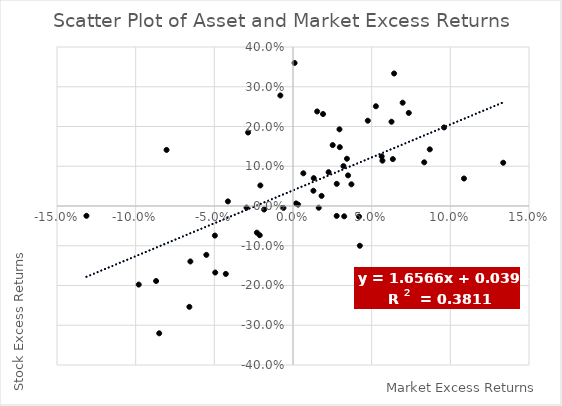
| Category | Series 0 |
|---|---|
| -0.06587087129683424 | -0.254 |
| 0.06260934946115085 | 0.212 |
| 0.01815649147565336 | 0.025 |
| -0.018343063746821885 | -0.009 |
| 0.012971536542138586 | 0.038 |
| 0.025224695968268752 | 0.153 |
| 0.0349983023841872 | 0.077 |
| 0.02262080186645983 | 0.085 |
| 0.0032107368412471428 | 0.004 |
| -0.08036566176639262 | 0.141 |
| -0.13128730198391583 | -0.025 |
| 0.13361053214688012 | 0.109 |
| 0.04754526597522245 | 0.215 |
| 0.013175469841449006 | 0.07 |
| 0.0634518169512963 | 0.118 |
| 0.06969687803905077 | 0.26 |
| -0.04138149329786979 | 0.012 |
| -0.021130452510789387 | -0.073 |
| 0.10867709437956295 | 0.069 |
| 0.032546548423369334 | -0.026 |
| -0.006071305706916397 | -0.005 |
| 0.027805366320762026 | 0.056 |
| 0.04198659736409405 | -0.027 |
| 0.056358993397591206 | 0.125 |
| 0.006566184517935447 | 0.082 |
| 0.019093292384859906 | 0.231 |
| 0.02776392302925701 | -0.025 |
| 0.029759909155611997 | 0.148 |
| -0.04965016943263956 | -0.074 |
| 0.07359225346111042 | 0.234 |
| -0.008035029583311148 | 0.278 |
| 0.042484995043039694 | -0.1 |
| -0.04941337230773957 | -0.167 |
| -0.02951696682537186 | -0.004 |
| 0.03427693124145169 | 0.119 |
| -0.08503512794712244 | -0.32 |
| 0.001957221761581274 | 0.006 |
| -0.08700670628842684 | -0.189 |
| 0.09600492020711796 | 0.198 |
| -0.04270205866598241 | -0.171 |
| -0.09805851862904523 | -0.198 |
| 0.08341711260787774 | 0.11 |
| 0.052691439086468686 | 0.251 |
| -0.06523593225574922 | -0.14 |
| 0.06426837786935607 | 0.333 |
| -0.02854279762847038 | 0.185 |
| 0.029534895940319265 | 0.193 |
| 0.016352385873959433 | -0.004 |
| 0.001016200261922776 | 0.36 |
| 0.0568591971169885 | 0.114 |
| 0.03206941356827814 | 0.1 |
| -0.020752020898636977 | 0.052 |
| -0.05508266896738148 | -0.123 |
| -0.022957877947815526 | -0.067 |
| 0.08694381342304865 | 0.142 |
| 0.03713300938151762 | 0.055 |
| 0.015345434903633864 | 0.238 |